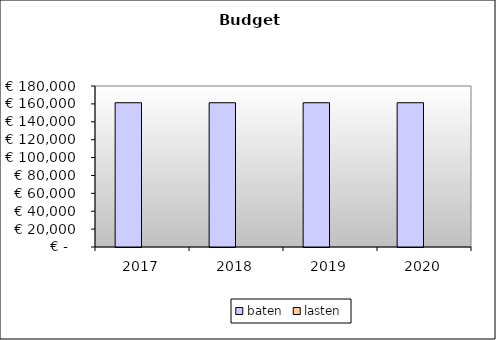
| Category | baten | lasten |
|---|---|---|
| 2017.0 | 161273.85 | 0 |
| 2018.0 | 161273.85 | 0 |
| 2019.0 | 161273.85 | 0 |
| 2020.0 | 161273.85 | 0 |